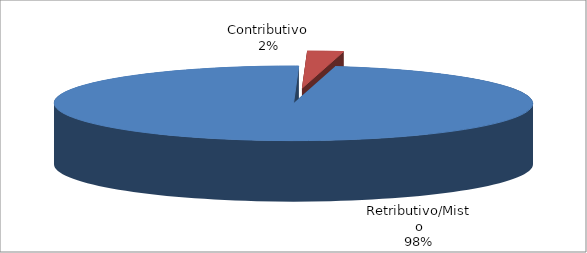
| Category | Series 1 |
|---|---|
| Retributivo/Misto | 155265 |
| Contributivo | 3871 |